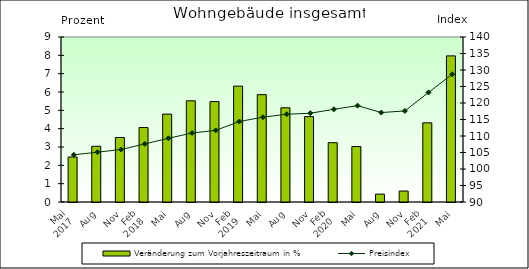
| Category | Veränderung zum Vorjahreszeitraum in % |
|---|---|
| 0 | 2.456 |
| 1 | 3.039 |
| 2 | 3.519 |
| 3 | 4.062 |
| 4 | 4.794 |
| 5 | 5.519 |
| 6 | 5.477 |
| 7 | 6.32 |
| 8 | 5.855 |
| 9 | 5.14 |
| 10 | 4.655 |
| 11 | 3.234 |
| 12 | 3.025 |
| 13 | 0.429 |
| 14 | 0.599 |
| 15 | 4.318 |
| 16 | 7.97 |